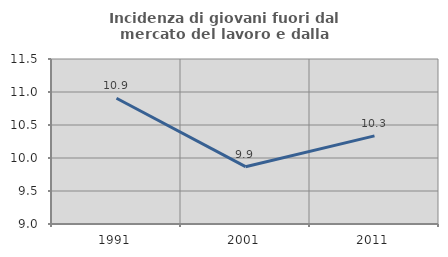
| Category | Incidenza di giovani fuori dal mercato del lavoro e dalla formazione  |
|---|---|
| 1991.0 | 10.905 |
| 2001.0 | 9.868 |
| 2011.0 | 10.335 |